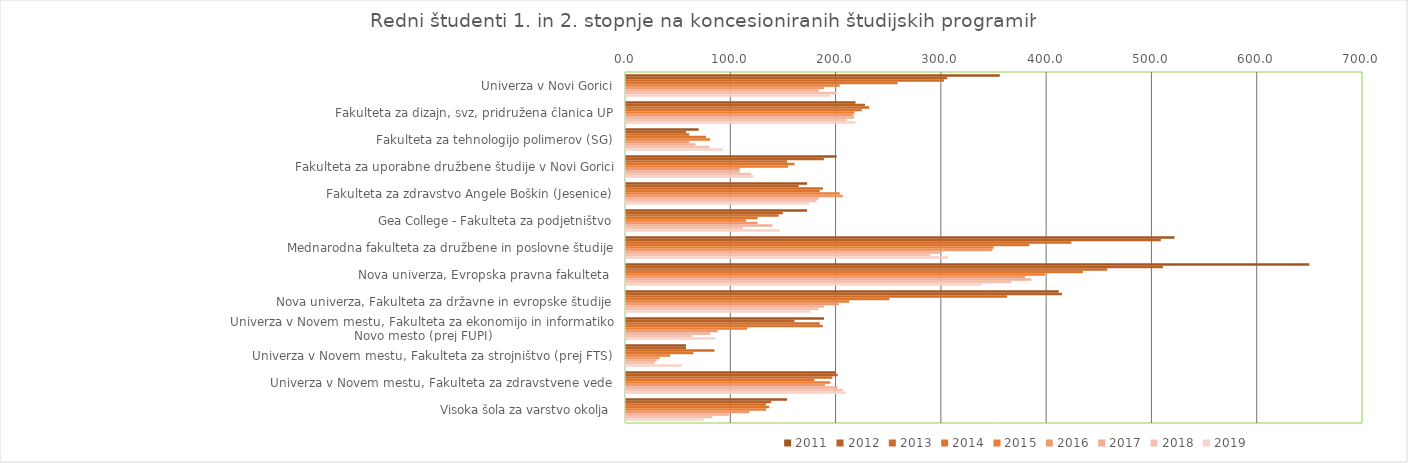
| Category | 2011 | 2012 | 2013 | 2014 | 2015 | 2016 | 2017 | 2018 | 2019 |
|---|---|---|---|---|---|---|---|---|---|
| Univerza v Novi Gorici | 355 | 305 | 302 | 258 | 203 | 188 | 183 | 200 | 194 |
| Fakulteta za dizajn, svz, pridružena članica UP | 218 | 227 | 231 | 224 | 217 | 216 | 217 | 210 | 218 |
| Fakulteta za tehnologijo polimerov (SG) | 69 | 57 | 60 | 76 | 80 | 60 | 66 | 79 | 92 |
| Fakulteta za uporabne družbene študije v Novi Gorici | 200 | 188 | 153 | 160 | 154 | 108 | 108 | 119 | 121 |
| Fakulteta za zdravstvo Angele Boškin (Jesenice) | 172 | 164 | 187 | 184 | 203 | 206 | 183 | 181 | 174 |
| Gea College - Fakulteta za podjetništvo | 172 | 149 | 145 | 125 | 114 | 125 | 139 | 111 | 146 |
| Mednarodna fakulteta za družbene in poslovne študije | 521 | 508 | 423 | 383 | 349 | 348 | 298 | 289 | 306 |
| Nova univerza, Evropska pravna fakulteta  | 649 | 510 | 457 | 434 | 398 | 379 | 385 | 366 | 338 |
| Nova univerza, Fakulteta za državne in evropske študije | 411 | 414 | 362 | 250 | 212 | 202 | 188 | 183 | 175 |
| Univerza v Novem mestu, Fakulteta za ekonomijo in informatiko Novo mesto (prej FUPI) | 188 | 160 | 184 | 187 | 115 | 87 | 80 | 63 | 85 |
| Univerza v Novem mestu, Fakulteta za strojništvo (prej FTS) | 57 | 57 | 84 | 64 | 42 | 32 | 29 | 27 | 53 |
| Univerza v Novem mestu, Fakulteta za zdravstvene vede | 199 | 201 | 196 | 179 | 194 | 189 | 201 | 206 | 209 |
| Visoka šola za varstvo okolja | 153 | 138 | 133 | 136 | 133 | 117 | 98 | 82 | 74 |